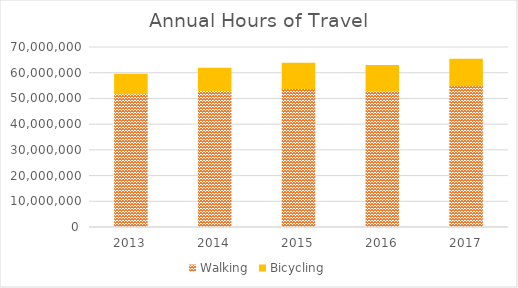
| Category | Walking | Bicycling |
|---|---|---|
| 2013 | 51975604.098 | 7579908.573 |
| 2014 | 53292896.254 | 8659600.231 |
| 2015 | 54093718.835 | 9773683.842 |
| 2016 | 53087925.93 | 9899106.936 |
| 2017 | 55156973.246 | 10311375.122 |